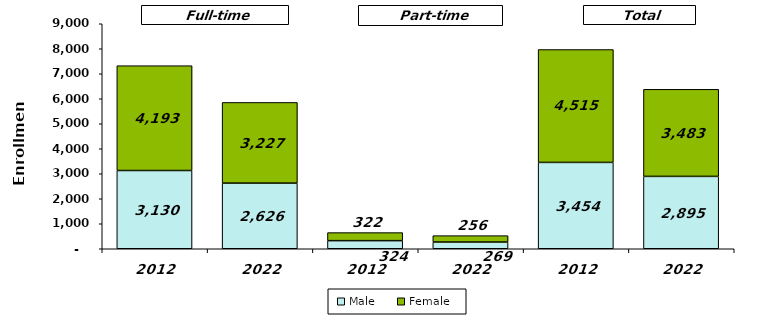
| Category | Male | Female |
|---|---|---|
| 2012.0 | 3130 | 4193 |
| 2022.0 | 2626 | 3227 |
| 2012.0 | 324 | 322 |
| 2022.0 | 269 | 256 |
| 2012.0 | 3454 | 4515 |
| 2022.0 | 2895 | 3483 |